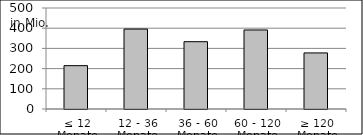
| Category | Volumen |
|---|---|
| ≤ 12 Monate | 214527686.2 |
| 12 - 36 Monate | 395699280.9 |
| 36 - 60 Monate | 333174266.57 |
| 60 - 120 Monate | 391207139.902 |
| ≥ 120 Monate | 277567831.956 |